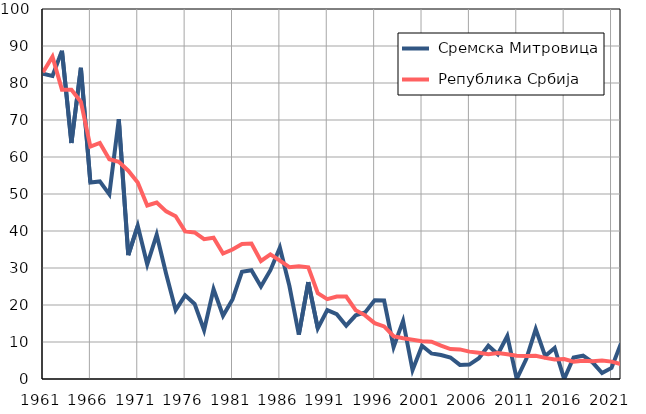
| Category |  Сремска Митровица |  Република Србија |
|---|---|---|
| 1961.0 | 82.5 | 82.9 |
| 1962.0 | 81.9 | 87.1 |
| 1963.0 | 88.7 | 78.2 |
| 1964.0 | 63.8 | 78.2 |
| 1965.0 | 84.1 | 74.9 |
| 1966.0 | 53.1 | 62.8 |
| 1967.0 | 53.4 | 63.8 |
| 1968.0 | 49.9 | 59.4 |
| 1969.0 | 70.2 | 58.7 |
| 1970.0 | 33.5 | 56.3 |
| 1971.0 | 41.4 | 53.1 |
| 1972.0 | 31 | 46.9 |
| 1973.0 | 39 | 47.7 |
| 1974.0 | 28.4 | 45.3 |
| 1975.0 | 18.6 | 44 |
| 1976.0 | 22.6 | 39.9 |
| 1977.0 | 20.3 | 39.6 |
| 1978.0 | 13.2 | 37.8 |
| 1979.0 | 24.3 | 38.2 |
| 1980.0 | 17.1 | 33.9 |
| 1981.0 | 21.5 | 35 |
| 1982.0 | 29 | 36.5 |
| 1983.0 | 29.4 | 36.6 |
| 1984.0 | 25 | 31.9 |
| 1985.0 | 29.4 | 33.7 |
| 1986.0 | 35.5 | 32 |
| 1987.0 | 25.2 | 30.2 |
| 1988.0 | 12 | 30.5 |
| 1989.0 | 26.2 | 30.2 |
| 1990.0 | 13.7 | 23.2 |
| 1991.0 | 18.6 | 21.6 |
| 1992.0 | 17.5 | 22.3 |
| 1993.0 | 14.4 | 22.3 |
| 1994.0 | 17.2 | 18.6 |
| 1995.0 | 18 | 17.2 |
| 1996.0 | 21.3 | 15.1 |
| 1997.0 | 21.2 | 14.2 |
| 1998.0 | 8.6 | 11.6 |
| 1999.0 | 15.7 | 11 |
| 2000.0 | 2.4 | 10.6 |
| 2001.0 | 9 | 10.2 |
| 2002.0 | 6.9 | 10.1 |
| 2003.0 | 6.5 | 9 |
| 2004.0 | 5.8 | 8.1 |
| 2005.0 | 3.8 | 8 |
| 2006.0 | 3.9 | 7.4 |
| 2007.0 | 5.6 | 7.1 |
| 2008.0 | 9 | 6.7 |
| 2009.0 | 6.7 | 7 |
| 2010.0 | 11.6 | 6.7 |
| 2011.0 | 0 | 6.3 |
| 2012.0 | 5.4 | 6.2 |
| 2013.0 | 13.5 | 6.3 |
| 2014.0 | 6.2 | 5.7 |
| 2015.0 | 8.4 | 5.3 |
| 2016.0 | 0 | 5.4 |
| 2017.0 | 5.8 | 4.7 |
| 2018.0 | 6.3 | 4.9 |
| 2019.0 | 4.5 | 4.8 |
| 2020.0 | 1.6 | 5 |
| 2021.0 | 3 | 4.7 |
| 2022.0 | 9.6 | 4 |